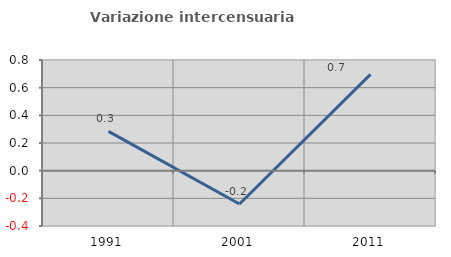
| Category | Variazione intercensuaria annua |
|---|---|
| 1991.0 | 0.284 |
| 2001.0 | -0.241 |
| 2011.0 | 0.696 |